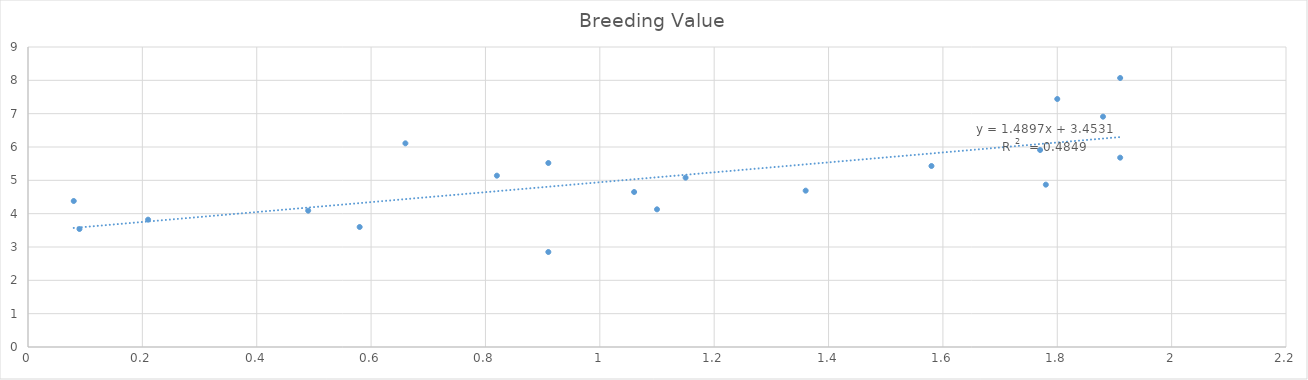
| Category | Breeding Value |
|---|---|
| 1.58 | 5.43 |
| 0.09 | 3.54 |
| 0.82 | 5.14 |
| 0.58 | 3.6 |
| 1.91 | 8.07 |
| 1.88 | 6.91 |
| 1.15 | 5.08 |
| 1.1 | 4.13 |
| 1.06 | 4.65 |
| 1.8 | 7.44 |
| 0.91 | 2.85 |
| 0.66 | 6.11 |
| 0.91 | 5.52 |
| 0.08 | 4.38 |
| 0.21 | 3.82 |
| 1.91 | 5.68 |
| 1.36 | 4.69 |
| 0.49 | 4.09 |
| 1.77 | 5.91 |
| 1.78 | 4.87 |